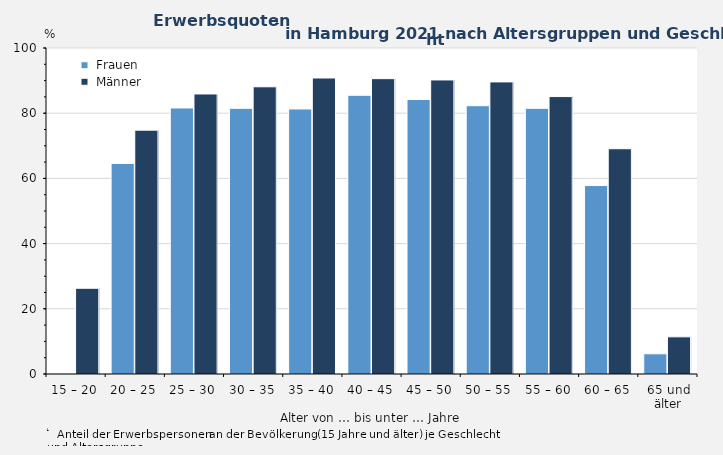
| Category |  Frauen |  Männer |
|---|---|---|
| 15 – 20 | 0 | 26.3 |
| 20 – 25 | 64.6 | 74.8 |
| 25 – 30 | 81.6 | 85.9 |
| 30 – 35 | 81.5 | 88.1 |
| 35 – 40 | 81.3 | 90.8 |
| 40 – 45 | 85.5 | 90.6 |
| 45 – 50 | 84.2 | 90.2 |
| 50 – 55 | 82.3 | 89.6 |
| 55 – 60 | 81.5 | 85.1 |
| 60 – 65 | 57.8 | 69.1 |
| 65 und älter | 6.2 | 11.4 |